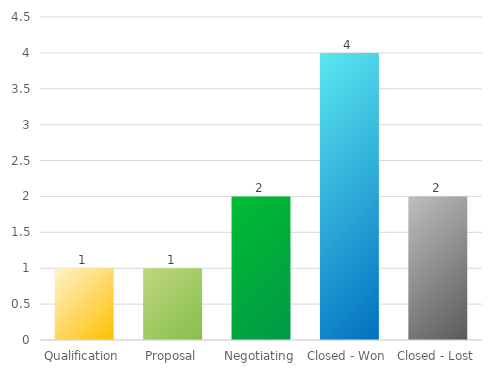
| Category | Series 0 |
|---|---|
| Qualification | 1 |
| Proposal | 1 |
| Negotiating | 2 |
| Closed - Won | 4 |
| Closed - Lost | 2 |